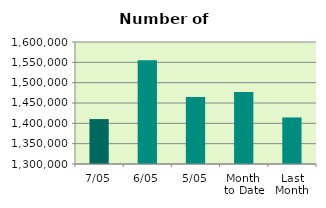
| Category | Series 0 |
|---|---|
| 7/05 | 1410434 |
| 6/05 | 1554850 |
| 5/05 | 1464956 |
| Month 
to Date | 1476904.4 |
| Last
Month | 1414476.2 |